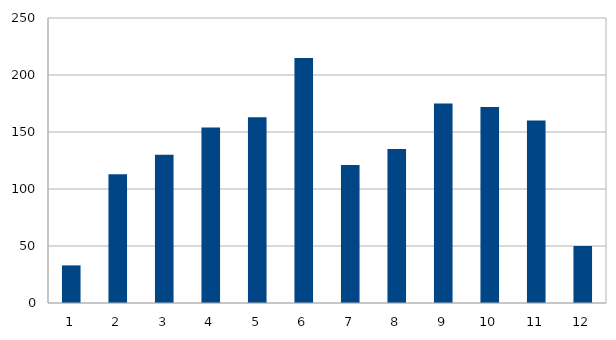
| Category | Series 0 |
|---|---|
| 0 | 33 |
| 1 | 113 |
| 2 | 130 |
| 3 | 154 |
| 4 | 163 |
| 5 | 215 |
| 6 | 121 |
| 7 | 135 |
| 8 | 175 |
| 9 | 172 |
| 10 | 160 |
| 11 | 50 |